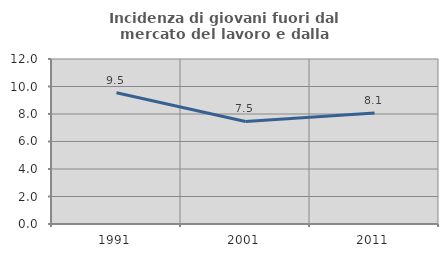
| Category | Incidenza di giovani fuori dal mercato del lavoro e dalla formazione  |
|---|---|
| 1991.0 | 9.549 |
| 2001.0 | 7.457 |
| 2011.0 | 8.066 |